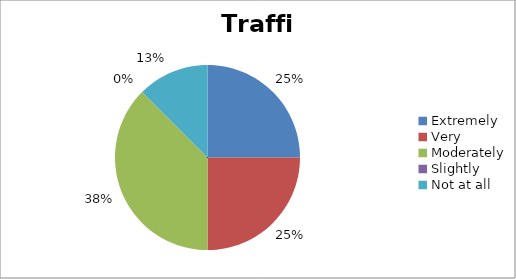
| Category | Traffic |
|---|---|
| Extremely | 2 |
| Very | 2 |
| Moderately | 3 |
| Slightly | 0 |
| Not at all | 1 |